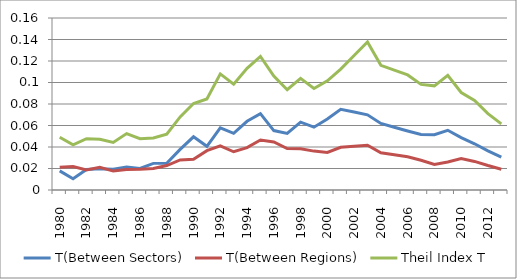
| Category | T(Between Sectors) | T(Between Regions) | Theil Index T |
|---|---|---|---|
| 1980.0 | 0.018 | 0.021 | 0.049 |
| 1981.0 | 0.01 | 0.022 | 0.042 |
| 1982.0 | 0.019 | 0.019 | 0.048 |
| 1983.0 | 0.02 | 0.021 | 0.047 |
| 1984.0 | 0.019 | 0.018 | 0.044 |
| 1985.0 | 0.021 | 0.019 | 0.052 |
| 1986.0 | 0.02 | 0.019 | 0.048 |
| 1987.0 | 0.025 | 0.02 | 0.048 |
| 1988.0 | 0.025 | 0.023 | 0.052 |
| 1989.0 | 0.038 | 0.028 | 0.068 |
| 1990.0 | 0.05 | 0.029 | 0.08 |
| 1991.0 | 0.041 | 0.037 | 0.085 |
| 1992.0 | 0.058 | 0.041 | 0.108 |
| 1993.0 | 0.053 | 0.036 | 0.098 |
| 1994.0 | 0.064 | 0.039 | 0.113 |
| 1995.0 | 0.071 | 0.046 | 0.124 |
| 1996.0 | 0.055 | 0.045 | 0.106 |
| 1997.0 | 0.053 | 0.039 | 0.093 |
| 1998.0 | 0.063 | 0.038 | 0.104 |
| 1999.0 | 0.058 | 0.036 | 0.094 |
| 2000.0 | 0.066 | 0.035 | 0.102 |
| 2001.0 | 0.075 | 0.04 | 0.112 |
| 2002.0 | 0.073 | 0.041 | 0.125 |
| 2003.0 | 0.07 | 0.042 | 0.138 |
| 2004.0 | 0.062 | 0.035 | 0.116 |
| 2005.0 | 0.058 | 0.033 | 0.112 |
| 2006.0 | 0.055 | 0.031 | 0.107 |
| 2007.0 | 0.052 | 0.028 | 0.098 |
| 2008.0 | 0.051 | 0.024 | 0.097 |
| 2009.0 | 0.056 | 0.026 | 0.107 |
| 2010.0 | 0.049 | 0.029 | 0.091 |
| 2011.0 | 0.043 | 0.027 | 0.083 |
| 2012.0 | 0.036 | 0.023 | 0.071 |
| 2013.0 | 0.031 | 0.019 | 0.062 |